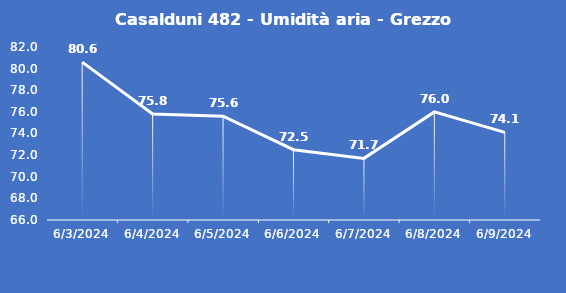
| Category | Casalduni 482 - Umidità aria - Grezzo (%) |
|---|---|
| 6/3/24 | 80.6 |
| 6/4/24 | 75.8 |
| 6/5/24 | 75.6 |
| 6/6/24 | 72.5 |
| 6/7/24 | 71.7 |
| 6/8/24 | 76 |
| 6/9/24 | 74.1 |